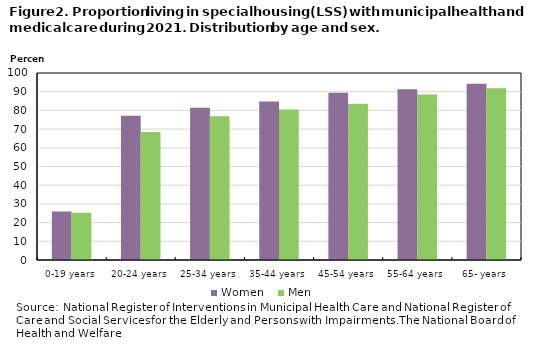
| Category | Women | Men |
|---|---|---|
| 0-19 years | 26 | 25.3 |
| 20-24 years | 77.1 | 68.5 |
| 25-34 years | 81.4 | 76.9 |
| 35-44 years | 84.7 | 80.5 |
| 45-54 years | 89.4 | 83.6 |
| 55-64 years | 91.3 | 88.5 |
| 65- years | 94.2 | 91.9 |